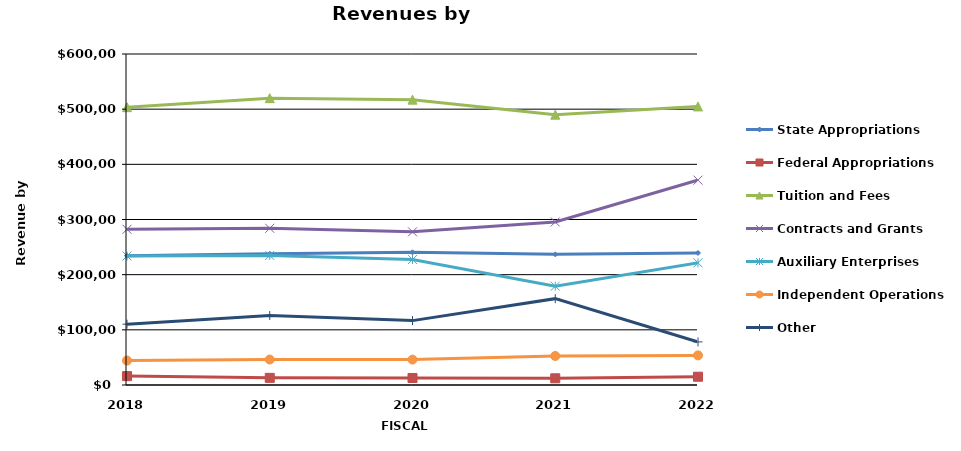
| Category | State Appropriations | Federal Appropriations | Tuition and Fees | Contracts and Grants | Auxiliary Enterprises | Independent Operations | Other |
|---|---|---|---|---|---|---|---|
| 2018.0 | 234396 | 16158 | 503619 | 282266 | 233870 | 44335 | 110270 |
| 2019.0 | 237884 | 12972 | 520006 | 284080 | 234846 | 46139 | 125959 |
| 2020.0 | 240526 | 12694 | 517257 | 277630 | 227374 | 45999 | 116706 |
| 2021.0 | 236784 | 12158 | 489989 | 295564 | 179212 | 52576 | 156510 |
| 2022.0 | 239318 | 14985 | 504955 | 371352 | 221433 | 53698 | 78098 |